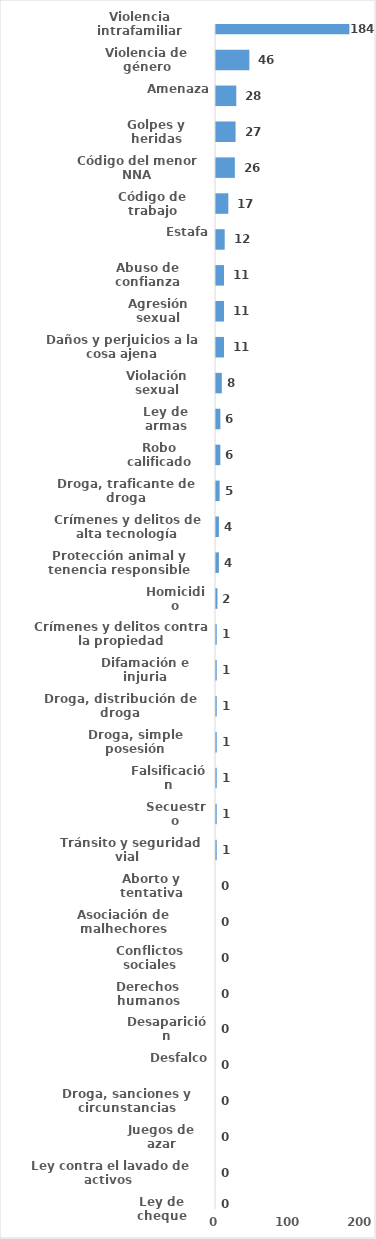
| Category | Series 0 |
|---|---|
| Violencia intrafamiliar | 184 |
| Violencia de género | 46 |
| Amenaza | 28 |
| Golpes y heridas | 27 |
| Código del menor NNA | 26 |
| Código de trabajo | 17 |
| Estafa | 12 |
| Abuso de confianza | 11 |
| Agresión sexual | 11 |
| Daños y perjuicios a la cosa ajena | 11 |
| Violación sexual | 8 |
| Ley de armas | 6 |
| Robo calificado | 6 |
| Droga, traficante de droga | 5 |
| Crímenes y delitos de alta tecnología | 4 |
| Protección animal y tenencia responsible | 4 |
| Homicidio | 2 |
| Crímenes y delitos contra la propiedad | 1 |
| Difamación e injuria | 1 |
| Droga, distribución de droga | 1 |
| Droga, simple posesión | 1 |
| Falsificación | 1 |
| Secuestro | 1 |
| Tránsito y seguridad vial  | 1 |
| Aborto y tentativa | 0 |
| Asociación de malhechores | 0 |
| Conflictos sociales | 0 |
| Derechos humanos | 0 |
| Desaparición | 0 |
| Desfalco | 0 |
| Droga, sanciones y circunstancias agravantes | 0 |
| Juegos de azar | 0 |
| Ley contra el lavado de activos  | 0 |
| Ley de cheque | 0 |